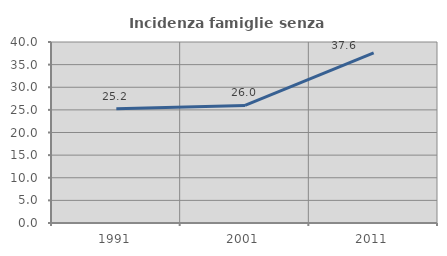
| Category | Incidenza famiglie senza nuclei |
|---|---|
| 1991.0 | 25.236 |
| 2001.0 | 25.971 |
| 2011.0 | 37.586 |